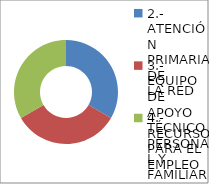
| Category | Series 0 |
|---|---|
| 2.- ATENCIÓN PRIMARIA DE
LA RED | 2 |
| 3.- EQUIPO DE APOYO TÉCNICO PERSONAL Y FAMILIAR PARA LA INCLUSIÓN SOCIAL | 2 |
| 4.- RECURSO PARA EL EMPLEO | 2 |